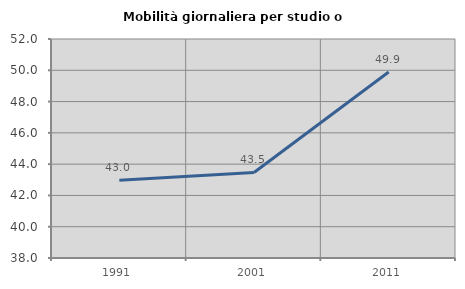
| Category | Mobilità giornaliera per studio o lavoro |
|---|---|
| 1991.0 | 42.971 |
| 2001.0 | 43.467 |
| 2011.0 | 49.887 |